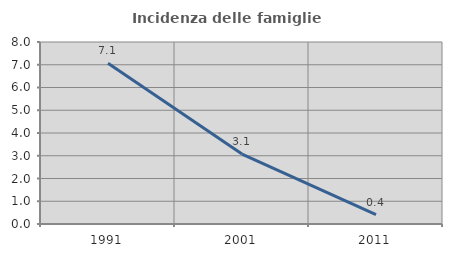
| Category | Incidenza delle famiglie numerose |
|---|---|
| 1991.0 | 7.064 |
| 2001.0 | 3.075 |
| 2011.0 | 0.414 |